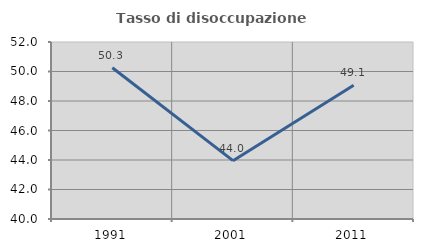
| Category | Tasso di disoccupazione giovanile  |
|---|---|
| 1991.0 | 50.251 |
| 2001.0 | 43.956 |
| 2011.0 | 49.074 |